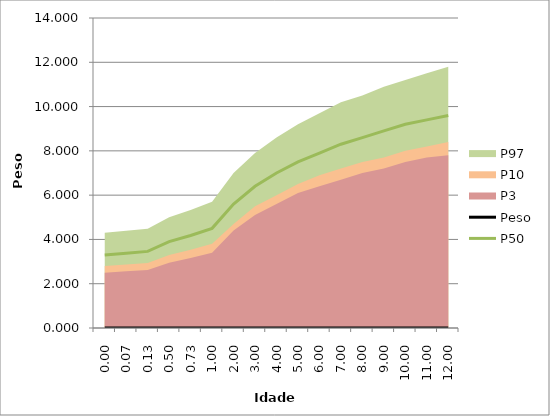
| Category | Peso | P50 |
|---|---|---|
| 0.0 |  | 3.3 |
| 0.06666666666666667 |  | 3.38 |
| 0.13333333333333333 |  | 3.46 |
| 0.5 |  | 3.9 |
| 0.7333333333333333 |  | 4.18 |
| 1.0 |  | 4.5 |
| 2.0 |  | 5.6 |
| 3.0 |  | 6.4 |
| 4.0 |  | 7 |
| 5.0 |  | 7.5 |
| 6.0 |  | 7.9 |
| 7.0 |  | 8.3 |
| 8.0 |  | 8.6 |
| 9.0 |  | 8.9 |
| 10.0 |  | 9.2 |
| 11.0 |  | 9.4 |
| 12.0 |  | 9.6 |